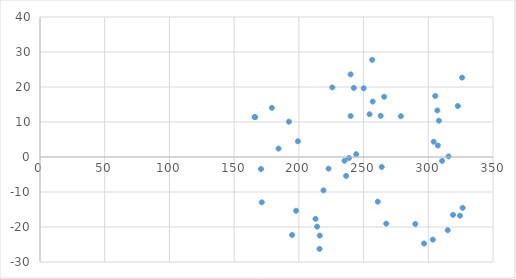
| Category | Series 0 |
|---|---|
| 239.99563348456522 | 11.704 |
| 212.8643895415821 | -17.664 |
| 289.94178710687504 | -19.142 |
| 326.527858484534 | -14.528 |
| 165.79579209504323 | 11.404 |
| 235.26821976722724 | -1.068 |
| 250.06708009976347 | 19.633 |
| 171.3453647197443 | -12.945 |
| 238.76239512352052 | -0.262 |
| 278.8426418574728 | 11.657 |
| 324.47246121612625 | -16.772 |
| 257.05543081235004 | 15.845 |
| 256.6443513586685 | 27.756 |
| 303.50740907836655 | -23.607 |
| 260.96068562232483 | -12.761 |
| 296.7245980926208 | -24.725 |
| 319.12842831826595 | -16.528 |
| 304.12402825888887 | 4.376 |
| 307.00158443465983 | 13.298 |
| 170.72874553922196 | -3.429 |
| 194.77689357959335 | -22.277 |
| 219.03058134680555 | -9.531 |
| 263.2216226175735 | 11.778 |
| 216.15302517103459 | -22.453 |
| 322.8281434014 | 14.572 |
| 254.58895409026067 | 12.211 |
| 214.09762790262675 | -19.898 |
| 239.99563348456522 | 23.604 |
| 305.3572666199336 | 17.443 |
| 222.93583615678037 | -3.336 |
| 179.15587433969398 | 14.044 |
| 192.31041685750398 | 10.09 |
| 236.50145812827193 | -5.401 |
| 267.5379568812299 | -19.038 |
| 310.7012995177939 | -1.101 |
| 225.8133923325513 | 19.887 |
| 315.63425296197266 | 0.166 |
| 166.2068715487248 | 11.393 |
| 308.23482279570453 | 10.365 |
| 265.8936390665036 | 17.206 |
| 197.85998948220507 | -15.36 |
| 244.3119677482216 | 0.788 |
| 315.0176337814503 | -20.918 |
| 264.04378152493655 | -2.844 |
| 242.46211020665456 | 19.738 |
| 307.4126638883414 | 3.287 |
| 184.29436751071353 | 2.406 |
| 215.94748544419383 | -26.247 |
| 326.1167790308525 | 22.683 |
| 199.29876757009055 | 4.501 |